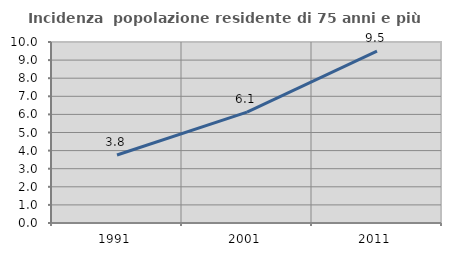
| Category | Incidenza  popolazione residente di 75 anni e più |
|---|---|
| 1991.0 | 3.759 |
| 2001.0 | 6.122 |
| 2011.0 | 9.494 |